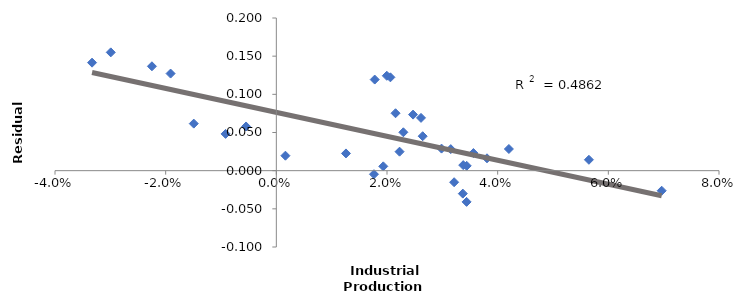
| Category | Series 0 |
|---|---|
| 0.06964488150720682 | -0.026 |
| 0.05649178320458903 | 0.014 |
| 0.04203107678643736 | 0.028 |
| 0.026146763098675363 | 0.069 |
| 0.0247094398660912 | 0.073 |
| 0.031525777193248894 | 0.028 |
| 0.035617680156712295 | 0.023 |
| 0.03807082364662895 | 0.016 |
| 0.026452013400438013 | 0.045 |
| 0.021539786938773897 | 0.075 |
| 0.0199617065246811 | 0.124 |
| 0.01777840876143011 | 0.119 |
| 0.0206142696488818 | 0.122 |
| 0.0229562813270745 | 0.05 |
| 0.022271917044063283 | 0.025 |
| 0.032131153338362806 | -0.015 |
| 0.03438599721644642 | -0.041 |
| 0.033704937667885515 | -0.03 |
| 0.017645111891006815 | -0.005 |
| -0.009171089937783927 | 0.048 |
| -0.014920864876124984 | 0.062 |
| -0.03330192086314698 | 0.141 |
| -0.029920150349845964 | 0.155 |
| -0.022479076553925448 | 0.137 |
| -0.019111892474337866 | 0.127 |
| -0.005468627628390177 | 0.058 |
| 0.0016431211286218605 | 0.02 |
| 0.01932973355410228 | 0.006 |
| 0.012585451324103492 | 0.023 |
| 0.029856922333459268 | 0.029 |
| 0.033772666857935896 | 0.007 |
| 0.034404806203642835 | 0.006 |